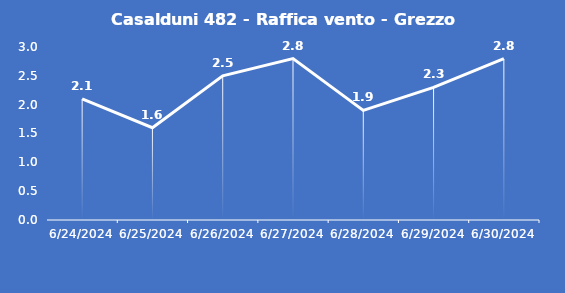
| Category | Casalduni 482 - Raffica vento - Grezzo (m/s) |
|---|---|
| 6/24/24 | 2.1 |
| 6/25/24 | 1.6 |
| 6/26/24 | 2.5 |
| 6/27/24 | 2.8 |
| 6/28/24 | 1.9 |
| 6/29/24 | 2.3 |
| 6/30/24 | 2.8 |